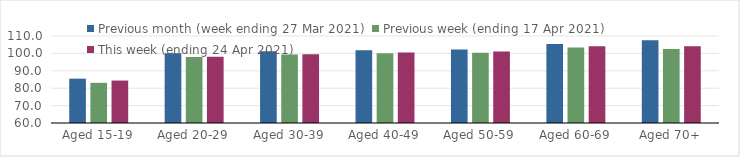
| Category | Previous month (week ending 27 Mar 2021) | Previous week (ending 17 Apr 2021) | This week (ending 24 Apr 2021) |
|---|---|---|---|
| Aged 15-19 | 85.48 | 83.09 | 84.39 |
| Aged 20-29 | 100.09 | 97.99 | 98.01 |
| Aged 30-39 | 101.26 | 99.39 | 99.53 |
| Aged 40-49 | 101.83 | 100.05 | 100.57 |
| Aged 50-59 | 102.19 | 100.36 | 101.05 |
| Aged 60-69 | 105.42 | 103.32 | 104.11 |
| Aged 70+ | 107.55 | 102.49 | 104.08 |